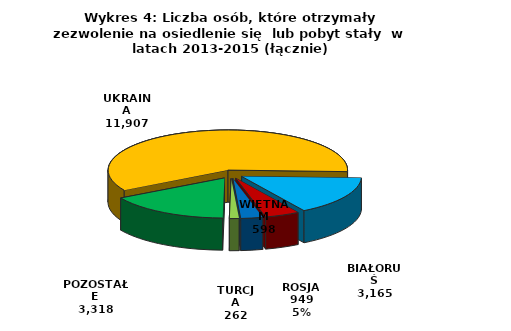
| Category | Series 0 |
|---|---|
| UKRAINA | 11907 |
| BIAŁORUŚ | 3165 |
| ROSJA | 949 |
| WIETNAM | 598 |
| TURCJA | 262 |
| POZOSTAŁE | 3318 |